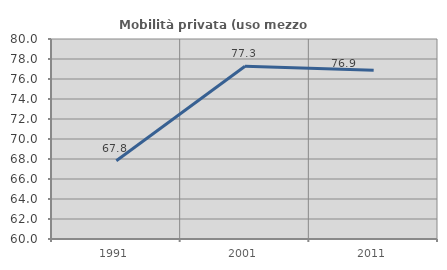
| Category | Mobilità privata (uso mezzo privato) |
|---|---|
| 1991.0 | 67.822 |
| 2001.0 | 77.268 |
| 2011.0 | 76.874 |